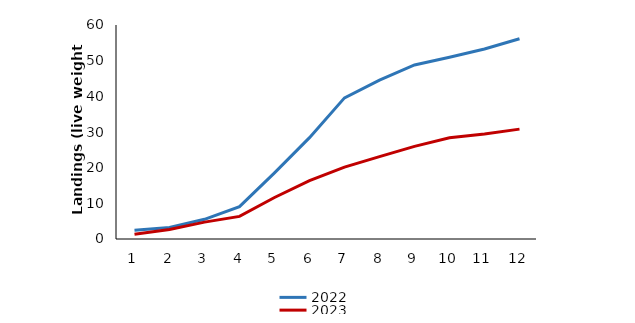
| Category | 2022 | 2023 |
|---|---|---|
| 1.0 | 2.462 | 1.341 |
| 2.0 | 3.207 | 2.648 |
| 3.0 | 5.524 | 4.736 |
| 4.0 | 9.086 | 6.328 |
| 5.0 | 18.541 | 11.629 |
| 6.0 | 28.411 | 16.384 |
| 7.0 | 39.567 | 20.168 |
| 8.0 | 44.553 | 23.108 |
| 9.0 | 48.809 | 25.958 |
| 10.0 | 50.974 | 28.403 |
| 11.0 | 53.273 | 29.468 |
| 12.0 | 56.153 | 30.803 |